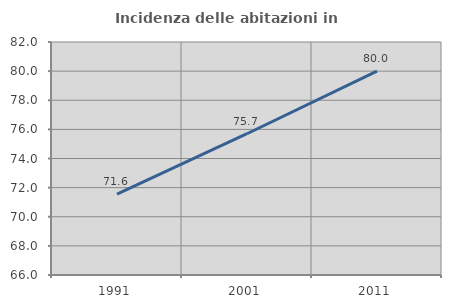
| Category | Incidenza delle abitazioni in proprietà  |
|---|---|
| 1991.0 | 71.56 |
| 2001.0 | 75.701 |
| 2011.0 | 80 |